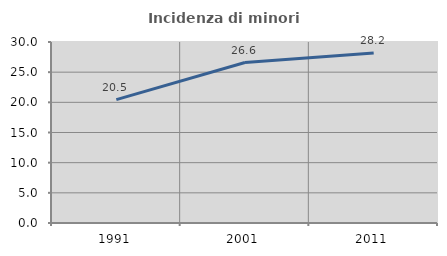
| Category | Incidenza di minori stranieri |
|---|---|
| 1991.0 | 20.455 |
| 2001.0 | 26.601 |
| 2011.0 | 28.191 |